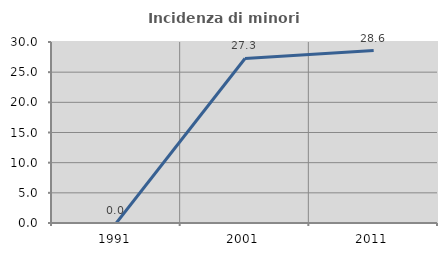
| Category | Incidenza di minori stranieri |
|---|---|
| 1991.0 | 0 |
| 2001.0 | 27.273 |
| 2011.0 | 28.571 |